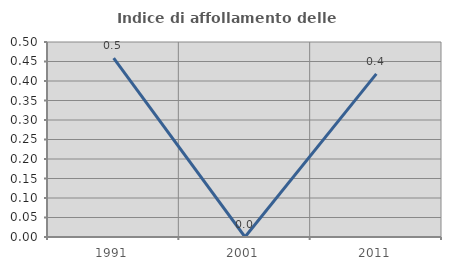
| Category | Indice di affollamento delle abitazioni  |
|---|---|
| 1991.0 | 0.459 |
| 2001.0 | 0 |
| 2011.0 | 0.418 |